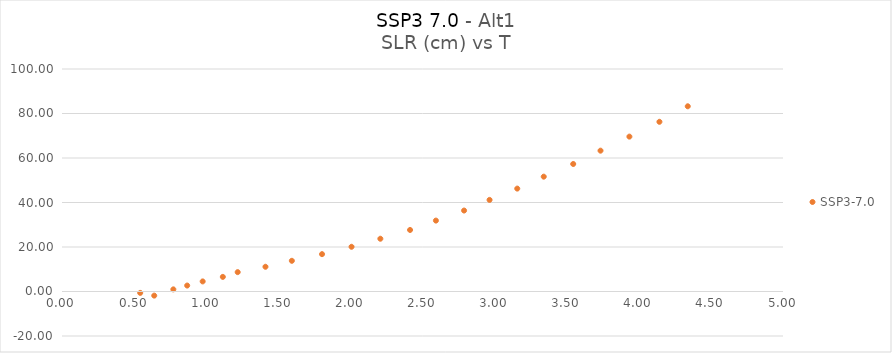
| Category | SSP3-7.0 |
|---|---|
| 0.639593181 | -1.853 |
| 0.542364652 | -0.626 |
| 0.772130534 | 0.958 |
| 0.868150926 | 2.678 |
| 0.975561417 | 4.531 |
| 1.115356613 | 6.565 |
| 1.218373475 | 8.703 |
| 1.410985436 | 11.118 |
| 1.593999848 | 13.794 |
| 1.803259946 | 16.789 |
| 2.007971221 | 20.098 |
| 2.207718083 | 23.716 |
| 2.413664456 | 27.658 |
| 2.593008574 | 31.87 |
| 2.788310632 | 36.386 |
| 2.965027005 | 41.168 |
| 3.15708926 | 46.249 |
| 3.340821123 | 51.612 |
| 3.545155632 | 57.305 |
| 3.734528966 | 63.296 |
| 3.934752593 | 69.61 |
| 4.14310573 | 76.268 |
| 4.339534848 | 83.244 |